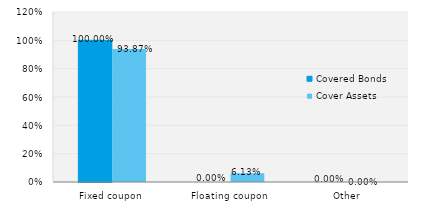
| Category | Covered Bonds | Cover Assets |
|---|---|---|
| Fixed coupon | 1 | 0.939 |
| Floating coupon | 0 | 0.061 |
| Other | 0 | 0 |